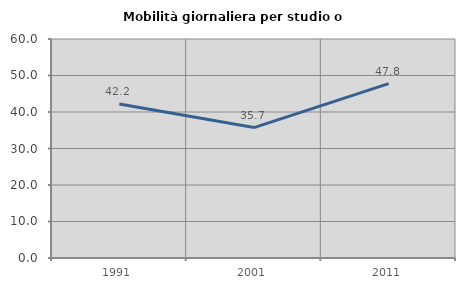
| Category | Mobilità giornaliera per studio o lavoro |
|---|---|
| 1991.0 | 42.184 |
| 2001.0 | 35.738 |
| 2011.0 | 47.791 |